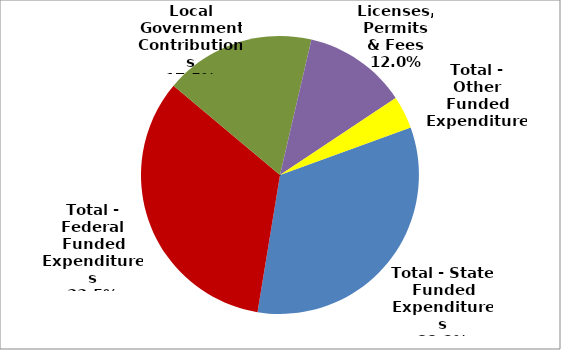
| Category | Series 0 |
|---|---|
| Total - State Funded Expenditures | 121196 |
| Total - Federal Funded Expenditures | 122577 |
| Local Government Contributions | 64054 |
| Licenses, Permits & Fees | 43944 |
| Total - Other Funded Expenditures | 13879 |